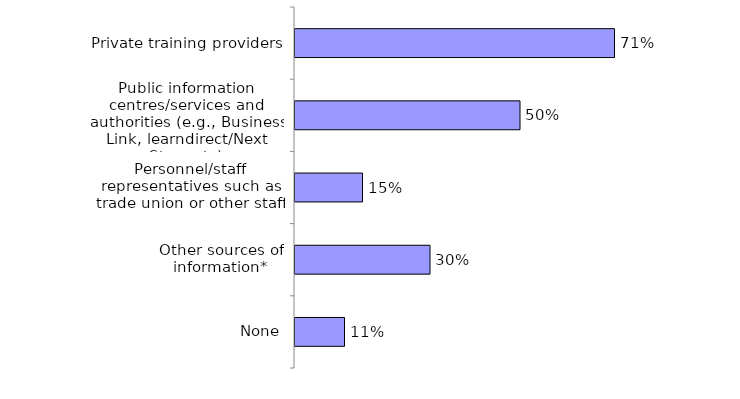
| Category | Series 0 |
|---|---|
| Private training providers | 0.71 |
| Public information centres/services and authorities (e.g., Business Link, learndirect/Next Step, etc) | 0.5 |
| Personnel/staff representatives such as trade union or other staff | 0.15 |
| Other sources of information* | 0.3 |
| None | 0.11 |